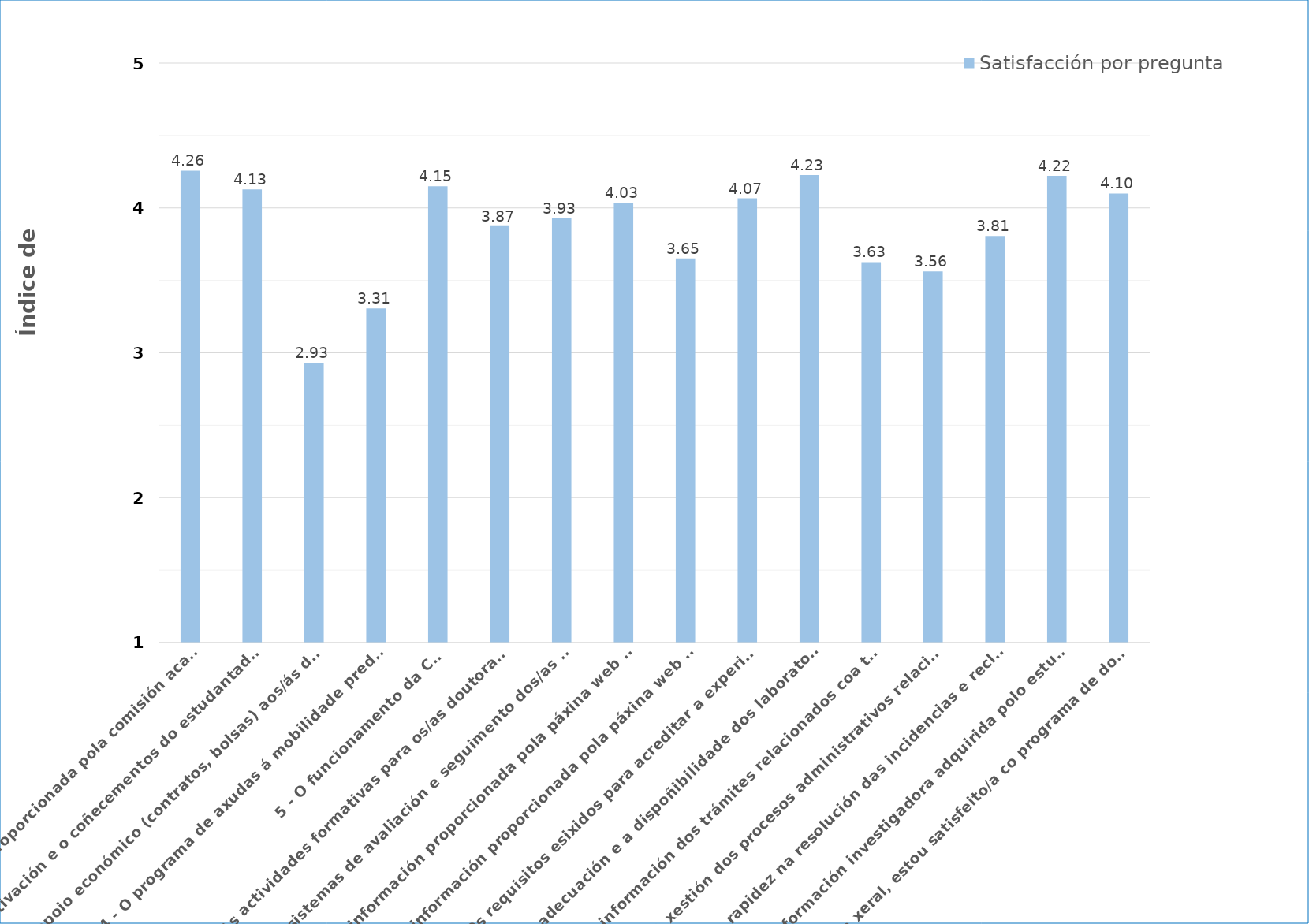
| Category | Satisfacción por pregunta |
|---|---|
| 1 - A información proporcionada pola comisión académica do programa de doutoramento (CAPD) | 4.257 |
| 2 - A motivación e o coñecementos do estudantado matriculado no programa | 4.128 |
| 3 - O apoio económico (contratos, bolsas) aos/ás doutorandos/as | 2.932 |
| 4 - O programa de axudas á mobilidade predoutoral | 3.306 |
| 5 - O funcionamento da CAPD | 4.15 |
| 6 - As actividades formativas para os/as doutorandos/as | 3.874 |
| 7 - Os sistemas de avaliación e seguimento dos/as doutorandos/as | 3.93 |
| 8 - A información proporcionada pola páxina web do programa | 4.034 |
| 9 - A información proporcionada pola páxina web da Escola Internacional de Doutoramento (Eido) | 3.652 |
| 10 - Os requisitos esixidos para acreditar a experiencia investigadora | 4.066 |
| 11 - A adecuación e a dispoñibilidade dos laboratorios, aulas, espazos para talleres, equipamentos especiais, recursos bibliográficos, recursos e redes de telecomunicacións | 4.227 |
| 12 - A información dos trámites relacionados coa tese de doutoramento | 3.626 |
| 13 - A xestión dos procesos administrativos relacionados coa dirección das teses | 3.562 |
| 14 - A rapidez na resolución das incidencias e reclamacións | 3.807 |
| 15 - A formación investigadora adquirida polo estudantado | 4.221 |
| 16 - En xeral, estou satisfeito/a co programa de doutoramento | 4.1 |